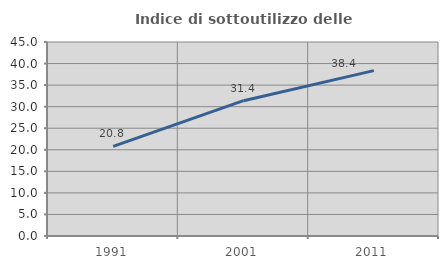
| Category | Indice di sottoutilizzo delle abitazioni  |
|---|---|
| 1991.0 | 20.793 |
| 2001.0 | 31.387 |
| 2011.0 | 38.362 |